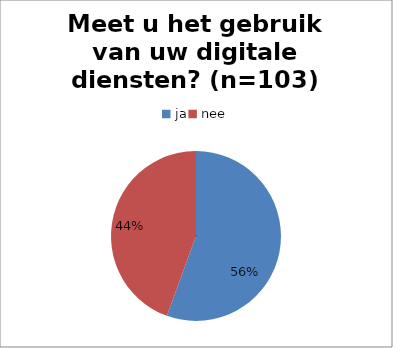
| Category | Series 0 |
|---|---|
| ja | 55 |
| nee | 44 |